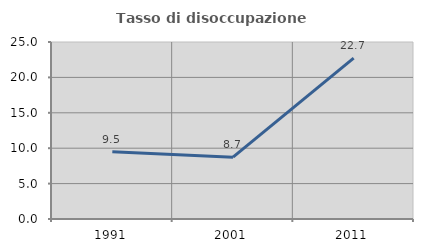
| Category | Tasso di disoccupazione giovanile  |
|---|---|
| 1991.0 | 9.497 |
| 2001.0 | 8.738 |
| 2011.0 | 22.727 |